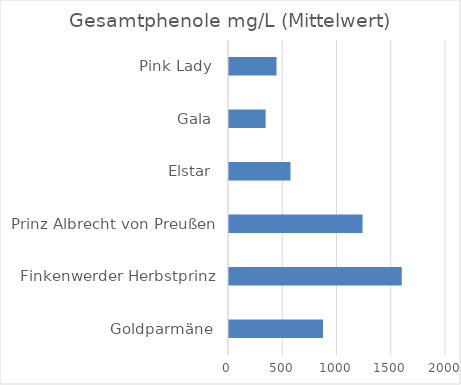
| Category | Gesamtphenole |
|---|---|
| Goldparmäne | 866.333 |
| Finkenwerder Herbstprinz | 1592.333 |
| Prinz Albrecht von Preußen | 1230.667 |
| Elstar | 567 |
| Gala | 337.667 |
| Pink Lady | 438 |